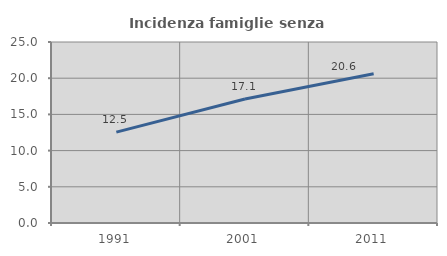
| Category | Incidenza famiglie senza nuclei |
|---|---|
| 1991.0 | 12.546 |
| 2001.0 | 17.135 |
| 2011.0 | 20.623 |